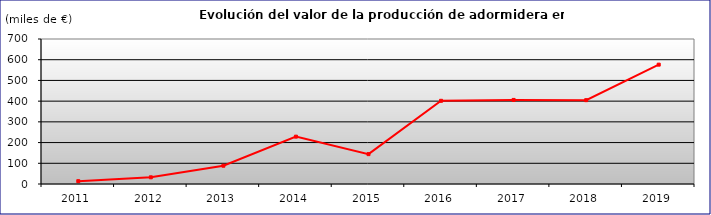
| Category | VALOR
(miles de €) |
|---|---|
| 2011.0 | 13.71 |
| 2012.0 | 32.3 |
| 2013.0 | 88.2 |
| 2014.0 | 228.6 |
| 2015.0 | 144.18 |
| 2016.0 | 401.62 |
| 2017.0 | 405.87 |
| 2018.0 | 404.7 |
| 2019.0 | 576.2 |